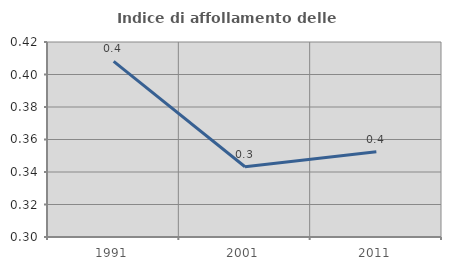
| Category | Indice di affollamento delle abitazioni  |
|---|---|
| 1991.0 | 0.408 |
| 2001.0 | 0.343 |
| 2011.0 | 0.352 |